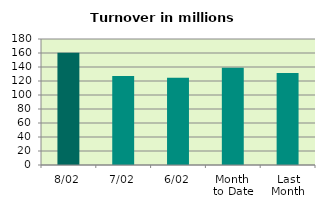
| Category | Series 0 |
|---|---|
| 8/02 | 160.397 |
| 7/02 | 127.148 |
| 6/02 | 124.695 |
| Month 
to Date | 138.993 |
| Last
Month | 131.402 |